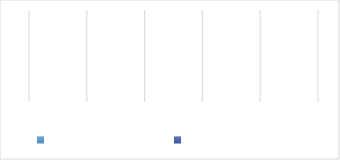
| Category | Total Co-Financing  | Total Aid Intensity  |
|---|---|---|
| 0 | 0 | 0 |